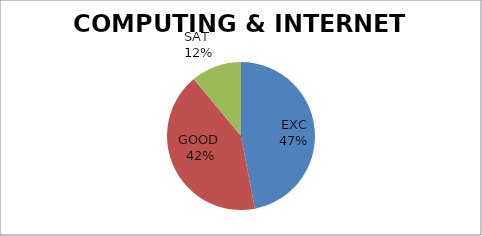
| Category | Series 0 |
|---|---|
| EXC | 47 |
| GOOD  | 42 |
| SAT  | 11 |